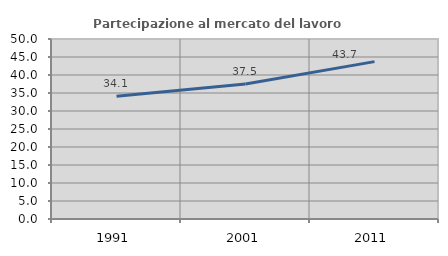
| Category | Partecipazione al mercato del lavoro  femminile |
|---|---|
| 1991.0 | 34.119 |
| 2001.0 | 37.519 |
| 2011.0 | 43.71 |